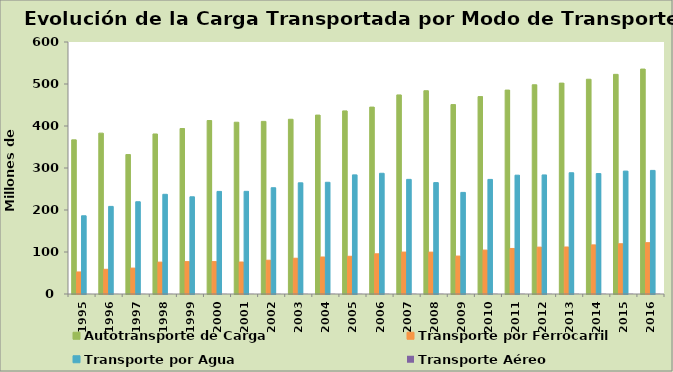
| Category | Autotransporte de Carga | Transporte por Ferrocarril | Transporte por Agua | Transporte Aéreo |
|---|---|---|---|---|
| 1995.0 | 367 | 52.48 | 186.26 | 0.252 |
| 1996.0 | 383 | 58.831 | 208.581 | 0.285 |
| 1997.0 | 332 | 61.666 | 219.653 | 0.335 |
| 1998.0 | 381 | 75.914 | 237.38 | 0.388 |
| 1999.0 | 394 | 77.062 | 231.44 | 0.407 |
| 2000.0 | 413 | 77.164 | 244.252 | 0.379 |
| 2001.0 | 409 | 76.182 | 244.431 | 0.351 |
| 2002.0 | 411 | 80.451 | 253.046 | 0.389 |
| 2003.0 | 416 | 85.168 | 264.739 | 0.41 |
| 2004.0 | 426 | 88.097 | 266.008 | 0.467 |
| 2005.0 | 436 | 89.814 | 283.604 | 0.529 |
| 2006.0 | 445 | 95.713 | 287.432 | 0.544 |
| 2007.0 | 474 | 99.845 | 272.934 | 0.572 |
| 2008.0 | 484 | 99.692 | 265.237 | 0.525 |
| 2009.0 | 451 | 90.321 | 241.923 | 0.466 |
| 2010.0 | 470 | 104.564 | 272.811 | 0.571 |
| 2011.0 | 485.502 | 108.433 | 282.902 | 0.562 |
| 2012.0 | 498.147 | 111.607 | 283.462 | 0.559 |
| 2013.0 | 502.15 | 111.933 | 288.696 | 0.582 |
| 2014.0 | 511.34 | 116.936 | 286.761 | 0.618 |
| 2015.0 | 522.99 | 119.646 | 292.645 | 0.655 |
| 2016.0 | 535.548 | 122.201 | 294.296 | 0.67 |